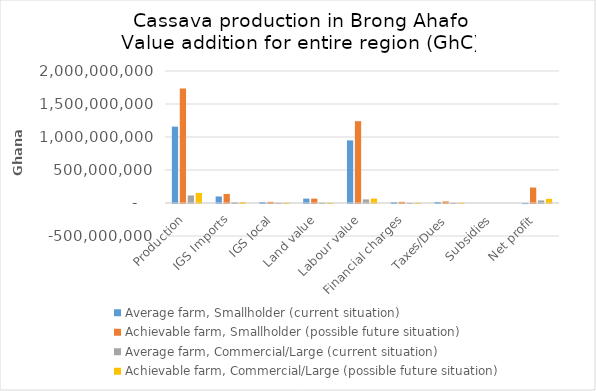
| Category | Average farm, Smallholder (current situation) | Achievable farm, Smallholder (possible future situation) | Average farm, Commercial/Large (current situation) | Achievable farm, Commercial/Large (possible future situation) |
|---|---|---|---|---|
| Production | 1157077546.56 | 1735616319.84 | 114185284.2 | 152247045.6 |
| IGS Imports | 98693079.995 | 136348315.616 | 11877634.672 | 13635347.959 |
| IGS local | 14668368.481 | 17422454.1 | 1968110.246 | 2375159.638 |
| Land value | 66290901.105 | 66290901.105 | 3488994.795 | 3488994.795 |
| Labour value | 948945209.65 | 1239665463.057 | 54440280.503 | 66349184.499 |
| Financial charges | 12910906.296 | 17558425.777 | 666080.825 | 666080.825 |
| Taxes/Dues | 16380150.209 | 24208638.58 | 2661630.428 | 2661630.428 |
| Subsidies | 0 | 0 | 0 | 0 |
| Net profit | -811069.175 | 234122121.606 | 39082552.731 | 63070647.456 |